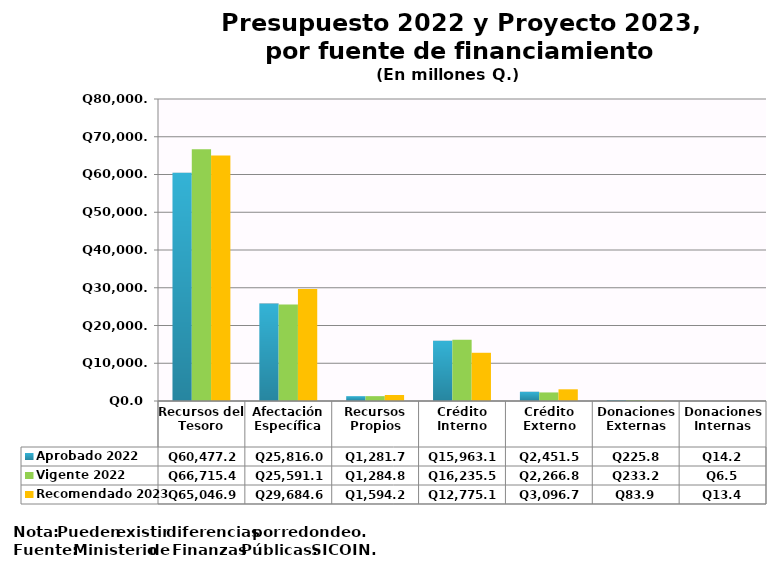
| Category | Aprobado 2022 | Vigente 2022 | Recomendado 2023 |
|---|---|---|---|
| Recursos del Tesoro | 60477.2 | 66715.4 | 65046.9 |
| Afectación Específica | 25816 | 25591.1 | 29684.6 |
| Recursos Propios | 1281.7 | 1284.8 | 1594.2 |
| Crédito Interno | 15963.1 | 16235.5 | 12775.1 |
| Crédito Externo | 2451.5 | 2266.8 | 3096.7 |
| Donaciones Externas | 225.8 | 233.2 | 83.9 |
| Donaciones Internas | 14.2 | 6.5 | 13.4 |